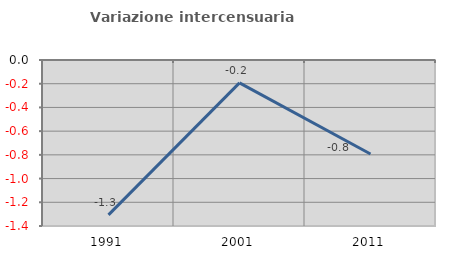
| Category | Variazione intercensuaria annua |
|---|---|
| 1991.0 | -1.306 |
| 2001.0 | -0.193 |
| 2011.0 | -0.793 |